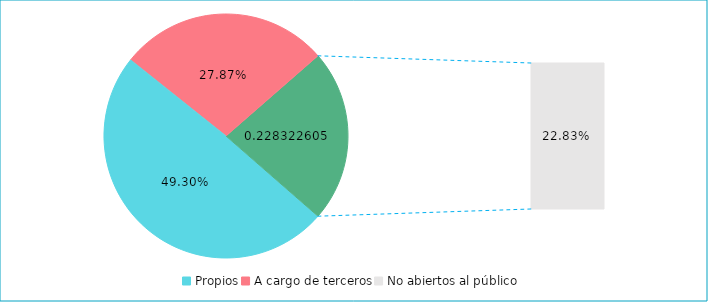
| Category | Series 0 |
|---|---|
| Propios | 0.493 |
| A cargo de terceros | 0.279 |
| No abiertos al público | 0.228 |